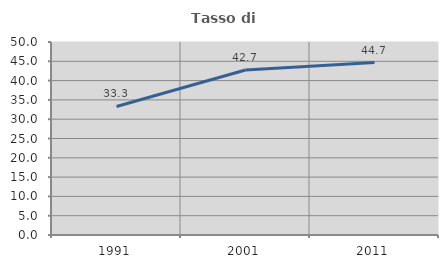
| Category | Tasso di occupazione   |
|---|---|
| 1991.0 | 33.298 |
| 2001.0 | 42.744 |
| 2011.0 | 44.682 |